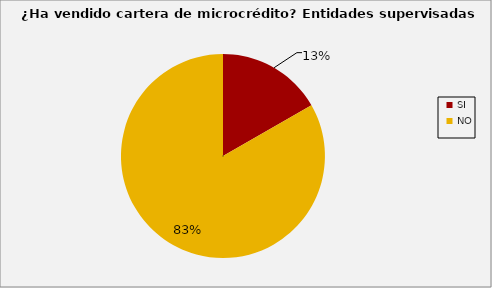
| Category | Series 0 |
|---|---|
| SI | 0.167 |
| NO | 0.833 |